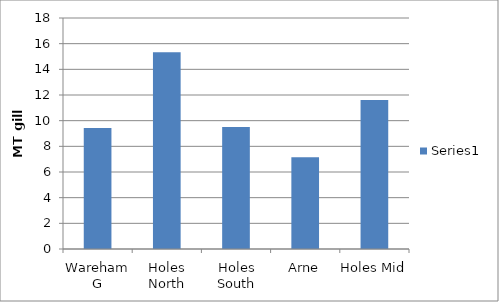
| Category | Series 0 |
|---|---|
| 	Wareham G | 9.42 |
| _x000b_Holes North | 15.338 |
| _x000b_Holes South | 9.501 |
| _x0004_Arne | 7.15 |
| 	Holes Mid | 11.618 |